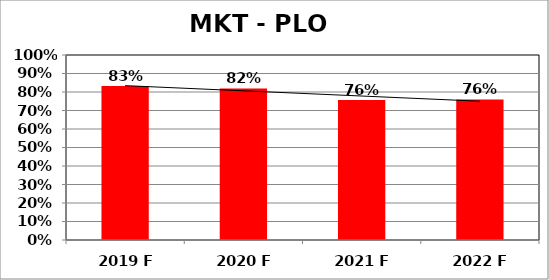
| Category | Series 0 |
|---|---|
| 2019 F | 0.833 |
| 2020 F | 0.819 |
| 2021 F | 0.757 |
| 2022 F | 0.76 |